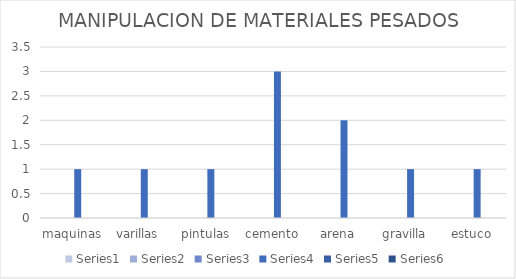
| Category | Series 0 | Series 1 | Series 2 | Series 3 | Series 4 | Series 5 |
|---|---|---|---|---|---|---|
| maquinas |  |  |  | 1 |  |  |
| varillas |  |  |  | 1 |  |  |
| pintulas |  |  |  | 1 |  |  |
| cemento |  |  |  | 3 |  |  |
| arena |  |  |  | 2 |  |  |
| gravilla |  |  |  | 1 |  |  |
| estuco |  |  |  | 1 |  |  |